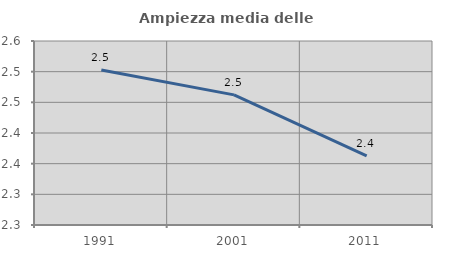
| Category | Ampiezza media delle famiglie |
|---|---|
| 1991.0 | 2.503 |
| 2001.0 | 2.462 |
| 2011.0 | 2.363 |